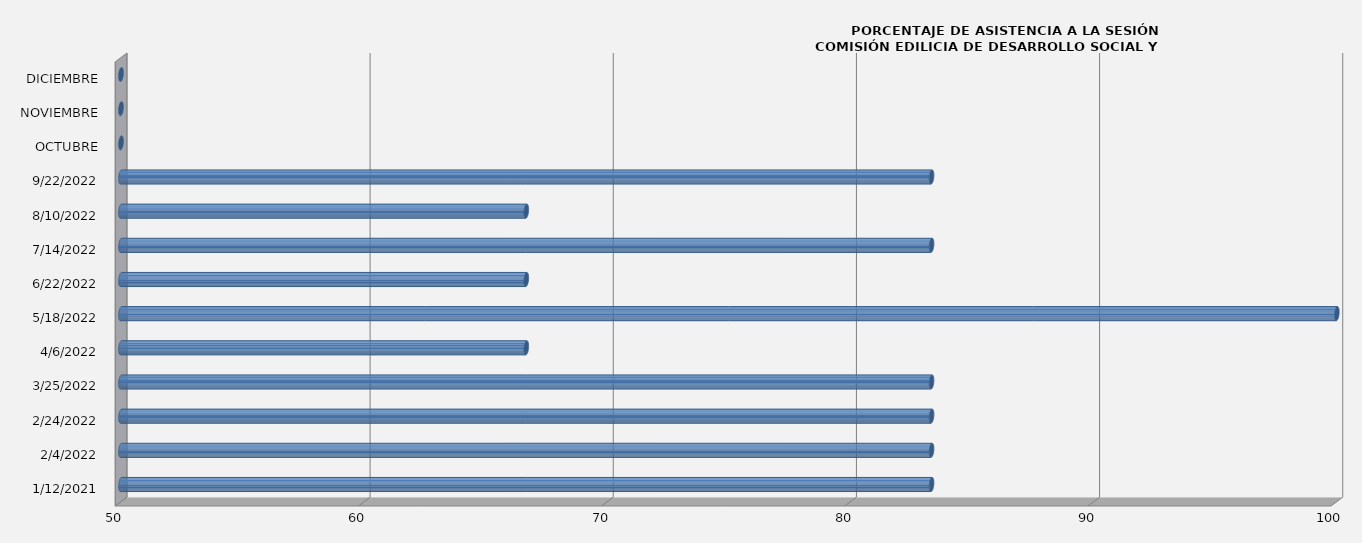
| Category | Series 0 |
|---|---|
| 12/01/2021 | 83.333 |
| 04/02/2022 | 83.333 |
| 24/02/2022 | 83.333 |
| 25/03/2022 | 83.333 |
| 06/04/2022 | 66.667 |
| 18/05/2022 | 100 |
| 22/06/2022 | 66.667 |
| 14/07/2022 | 83.333 |
| 10/08/2022 | 66.667 |
| 22/09/2022 | 83.333 |
| OCTUBRE | 0 |
| NOVIEMBRE | 0 |
| DICIEMBRE | 0 |